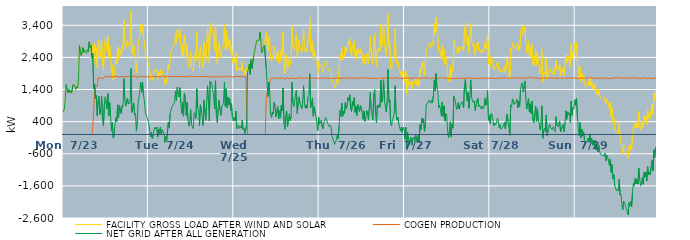
| Category | FACILITY GROSS LOAD AFTER WIND AND SOLAR | COGEN PRODUCTION | NET GRID AFTER ALL GENERATION |
|---|---|---|---|
|  Mon  7/23 | 702 | 0 | 702 |
|  Mon  7/23 | 799 | 0 | 799 |
|  Mon  7/23 | 1079 | 0 | 1079 |
|  Mon  7/23 | 1556 | 0 | 1556 |
|  Mon  7/23 | 1397 | 0 | 1397 |
|  Mon  7/23 | 1298 | 0 | 1298 |
|  Mon  7/23 | 1408 | 0 | 1408 |
|  Mon  7/23 | 1308 | 0 | 1308 |
|  Mon  7/23 | 1374 | 0 | 1374 |
|  Mon  7/23 | 1288 | 0 | 1288 |
|  Mon  7/23 | 1319 | 0 | 1319 |
|  Mon  7/23 | 1556 | 0 | 1556 |
|  Mon  7/23 | 1529 | 0 | 1529 |
|  Mon  7/23 | 1503 | 0 | 1503 |
|  Mon  7/23 | 1401 | 0 | 1401 |
|  Mon  7/23 | 1492 | 0 | 1492 |
|  Mon  7/23 | 1454 | 0 | 1454 |
|  Mon  7/23 | 1780 | 0 | 1780 |
|  Mon  7/23 | 2769 | 0 | 2769 |
|  Mon  7/23 | 2550 | 0 | 2550 |
|  Mon  7/23 | 2458 | 0 | 2458 |
|  Mon  7/23 | 2589 | 0 | 2589 |
|  Mon  7/23 | 2709 | 0 | 2709 |
|  Mon  7/23 | 2554 | 0 | 2554 |
|  Mon  7/23 | 2620 | 0 | 2620 |
|  Mon  7/23 | 2585 | 0 | 2585 |
|  Mon  7/23 | 2529 | 0 | 2529 |
|  Mon  7/23 | 2651 | 0 | 2651 |
|  Mon  7/23 | 2573 | 0 | 2573 |
|  Mon  7/23 | 2883 | 0 | 2883 |
|  Mon  7/23 | 2704 | 0 | 2704 |
|  Mon  7/23 | 2775 | 0 | 2775 |
|  Mon  7/23 | 2386 | 0 | 2386 |
|  Mon  7/23 | 2775 | 251 | 2524 |
|  Mon  7/23 | 2172 | 757 | 1415 |
|  Mon  7/23 | 2838 | 1263 | 1575 |
|  Mon  7/23 | 2608 | 1498 | 1110 |
|  Mon  7/23 | 2706 | 1492 | 1214 |
|  Mon  7/23 | 2077 | 1494 | 583 |
|  Mon  7/23 | 2824 | 1761 | 1063 |
|  Mon  7/23 | 2940 | 1755 | 1185 |
|  Mon  7/23 | 2398 | 1769 | 629 |
|  Mon  7/23 | 2560 | 1768 | 792 |
|  Mon  7/23 | 2927 | 1745 | 1182 |
|  Mon  7/23 | 2202 | 1740 | 462 |
|  Mon  7/23 | 2003 | 1742 | 261 |
|  Mon  7/23 | 2730 | 1789 | 941 |
|  Mon  7/23 | 2979 | 1807 | 1172 |
|  Mon  7/23 | 3000 | 1812 | 1188 |
|  Mon  7/23 | 2598 | 1799 | 799 |
|  Mon  7/23 | 3065 | 1792 | 1273 |
|  Mon  7/23 | 2387 | 1799 | 588 |
|  Mon  7/23 | 2784 | 1790 | 994 |
|  Mon  7/23 | 2394 | 1802 | 592 |
|  Mon  7/23 | 1924 | 1820 | 104 |
|  Mon  7/23 | 2160 | 1782 | 378 |
|  Mon  7/23 | 1696 | 1801 | -105 |
|  Mon  7/23 | 1768 | 1813 | -45 |
|  Mon  7/23 | 2136 | 1798 | 338 |
|  Mon  7/23 | 2332 | 1804 | 528 |
|  Mon  7/23 | 2198 | 1795 | 403 |
|  Mon  7/23 | 2732 | 1808 | 924 |
|  Mon  7/23 | 2335 | 1809 | 526 |
|  Mon  7/23 | 2693 | 1782 | 911 |
|  Mon  7/23 | 2543 | 1809 | 734 |
|  Mon  7/23 | 2457 | 1809 | 648 |
|  Mon  7/23 | 2711 | 1812 | 899 |
|  Mon  7/23 | 2653 | 1793 | 860 |
|  Mon  7/23 | 3557 | 1817 | 1740 |
|  Mon  7/23 | 2889 | 1802 | 1087 |
|  Mon  7/23 | 2673 | 1790 | 883 |
|  Mon  7/23 | 2658 | 1796 | 862 |
|  Mon  7/23 | 2923 | 1801 | 1122 |
|  Mon  7/23 | 2754 | 1798 | 956 |
|  Mon  7/23 | 2728 | 1799 | 929 |
|  Mon  7/23 | 2783 | 1804 | 979 |
|  Mon  7/23 | 3854 | 1802 | 2052 |
|  Mon  7/23 | 2509 | 1818 | 691 |
|  Mon  7/23 | 2657 | 1808 | 849 |
|  Mon  7/23 | 2794 | 1812 | 982 |
|  Mon  7/23 | 2410 | 1806 | 604 |
|  Mon  7/23 | 2460 | 1805 | 655 |
|  Mon  7/23 | 1906 | 1800 | 106 |
|  Mon  7/23 | 2208 | 1783 | 425 |
|  Mon  7/23 | 2785 | 1786 | 999 |
|  Mon  7/23 | 2978 | 1806 | 1172 |
|  Mon  7/23 | 2995 | 1811 | 1184 |
|  Mon  7/23 | 3436 | 1808 | 1628 |
|  Mon  7/23 | 3121 | 1813 | 1308 |
|  Mon  7/23 | 3409 | 1796 | 1613 |
|  Mon  7/23 | 3038 | 1807 | 1231 |
|  Mon  7/23 | 2859 | 1811 | 1048 |
|  Mon  7/23 | 2522 | 1798 | 724 |
|  Mon  7/23 | 2396 | 1796 | 600 |
|  Mon  7/23 | 2377 | 1807 | 570 |
|  Mon  7/23 | 2259 | 1800 | 459 |
|  Tue  7/24 | 2127 | 1796 | 331 |
|  Tue  7/24 | 2090 | 1790 | 300 |
|  Tue  7/24 | 1727 | 1795 | -68 |
|  Tue  7/24 | 1855 | 1794 | 61 |
|  Tue  7/24 | 1675 | 1801 | -126 |
|  Tue  7/24 | 1834 | 1815 | 19 |
|  Tue  7/24 | 1957 | 1810 | 147 |
|  Tue  7/24 | 2021 | 1796 | 225 |
|  Tue  7/24 | 1980 | 1812 | 168 |
|  Tue  7/24 | 2037 | 1804 | 233 |
|  Tue  7/24 | 1722 | 1804 | -82 |
|  Tue  7/24 | 1938 | 1789 | 149 |
|  Tue  7/24 | 1840 | 1811 | 29 |
|  Tue  7/24 | 2038 | 1808 | 230 |
|  Tue  7/24 | 1798 | 1801 | -3 |
|  Tue  7/24 | 1967 | 1820 | 147 |
|  Tue  7/24 | 1969 | 1810 | 159 |
|  Tue  7/24 | 1821 | 1802 | 19 |
|  Tue  7/24 | 1552 | 1799 | -247 |
|  Tue  7/24 | 1728 | 1793 | -65 |
|  Tue  7/24 | 1611 | 1813 | -202 |
|  Tue  7/24 | 1634 | 1819 | -185 |
|  Tue  7/24 | 2189 | 1805 | 384 |
|  Tue  7/24 | 2023 | 1809 | 214 |
|  Tue  7/24 | 2448 | 1807 | 641 |
|  Tue  7/24 | 2581 | 1804 | 777 |
|  Tue  7/24 | 2675 | 1809 | 866 |
|  Tue  7/24 | 2644 | 1800 | 844 |
|  Tue  7/24 | 2730 | 1781 | 949 |
|  Tue  7/24 | 2806 | 1812 | 994 |
|  Tue  7/24 | 3149 | 1801 | 1348 |
|  Tue  7/24 | 2857 | 1796 | 1061 |
|  Tue  7/24 | 3267 | 1800 | 1467 |
|  Tue  7/24 | 3079 | 1804 | 1275 |
|  Tue  7/24 | 2988 | 1819 | 1169 |
|  Tue  7/24 | 3261 | 1805 | 1456 |
|  Tue  7/24 | 2800 | 1810 | 990 |
|  Tue  7/24 | 2447 | 1799 | 648 |
|  Tue  7/24 | 2795 | 1807 | 988 |
|  Tue  7/24 | 2375 | 1810 | 565 |
|  Tue  7/24 | 3091 | 1810 | 1281 |
|  Tue  7/24 | 2966 | 1799 | 1167 |
|  Tue  7/24 | 2400 | 1809 | 591 |
|  Tue  7/24 | 2794 | 1794 | 1000 |
|  Tue  7/24 | 2283 | 1808 | 475 |
|  Tue  7/24 | 2073 | 1814 | 259 |
|  Tue  7/24 | 2182 | 1793 | 389 |
|  Tue  7/24 | 2598 | 1815 | 783 |
|  Tue  7/24 | 2125 | 1811 | 314 |
|  Tue  7/24 | 2031 | 1806 | 225 |
|  Tue  7/24 | 1972 | 1792 | 180 |
|  Tue  7/24 | 2484 | 1807 | 677 |
|  Tue  7/24 | 2433 | 1800 | 633 |
|  Tue  7/24 | 2293 | 1791 | 502 |
|  Tue  7/24 | 3197 | 1777 | 1420 |
|  Tue  7/24 | 2618 | 1801 | 817 |
|  Tue  7/24 | 2553 | 1781 | 772 |
|  Tue  7/24 | 2069 | 1798 | 271 |
|  Tue  7/24 | 2733 | 1809 | 924 |
|  Tue  7/24 | 2593 | 1814 | 779 |
|  Tue  7/24 | 2553 | 1804 | 749 |
|  Tue  7/24 | 2078 | 1796 | 282 |
|  Tue  7/24 | 2871 | 1811 | 1060 |
|  Tue  7/24 | 2842 | 1801 | 1041 |
|  Tue  7/24 | 2235 | 1795 | 440 |
|  Tue  7/24 | 2772 | 1804 | 968 |
|  Tue  7/24 | 3317 | 1800 | 1517 |
|  Tue  7/24 | 2844 | 1799 | 1045 |
|  Tue  7/24 | 2226 | 1807 | 419 |
|  Tue  7/24 | 3461 | 1802 | 1659 |
|  Tue  7/24 | 3425 | 1818 | 1607 |
|  Tue  7/24 | 3332 | 1779 | 1553 |
|  Tue  7/24 | 3361 | 1787 | 1574 |
|  Tue  7/24 | 2981 | 1808 | 1173 |
|  Tue  7/24 | 2609 | 1813 | 796 |
|  Tue  7/24 | 3459 | 1786 | 1673 |
|  Tue  7/24 | 2388 | 1798 | 590 |
|  Tue  7/24 | 2172 | 1802 | 370 |
|  Tue  7/24 | 2646 | 1814 | 832 |
|  Tue  7/24 | 2858 | 1794 | 1064 |
|  Tue  7/24 | 2579 | 1807 | 772 |
|  Tue  7/24 | 2382 | 1785 | 597 |
|  Tue  7/24 | 2664 | 1796 | 868 |
|  Tue  7/24 | 2658 | 1815 | 843 |
|  Tue  7/24 | 2785 | 1814 | 971 |
|  Tue  7/24 | 3424 | 1792 | 1632 |
|  Tue  7/24 | 2675 | 1797 | 878 |
|  Tue  7/24 | 3238 | 1818 | 1420 |
|  Tue  7/24 | 2650 | 1812 | 838 |
|  Tue  7/24 | 2976 | 1808 | 1168 |
|  Tue  7/24 | 2729 | 1808 | 921 |
|  Tue  7/24 | 2930 | 1810 | 1120 |
|  Tue  7/24 | 2562 | 1820 | 742 |
|  Tue  7/24 | 2742 | 1781 | 961 |
|  Tue  7/24 | 2317 | 1790 | 527 |
|  Tue  7/24 | 2212 | 1792 | 420 |
|  Wed  7/25 | 2347 | 1813 | 534 |
|  Wed  7/25 | 2223 | 1803 | 420 |
|  Wed  7/25 | 2523 | 1799 | 724 |
|  Wed  7/25 | 1988 | 1811 | 177 |
|  Wed  7/25 | 1998 | 1785 | 213 |
|  Wed  7/25 | 2096 | 1800 | 296 |
|  Wed  7/25 | 1990 | 1797 | 193 |
|  Wed  7/25 | 2059 | 1804 | 255 |
|  Wed  7/25 | 1997 | 1802 | 195 |
|  Wed  7/25 | 2247 | 1802 | 445 |
|  Wed  7/25 | 1949 | 1808 | 141 |
|  Wed  7/25 | 2007 | 1813 | 194 |
|  Wed  7/25 | 1821 | 1792 | 29 |
|  Wed  7/25 | 1847 | 1807 | 40 |
|  Wed  7/25 | 2074 | 1798 | 276 |
|  Wed  7/25 | 1924 | 0 | 1924 |
|  Wed  7/25 | 1922 | 0 | 1922 |
|  Wed  7/25 | 2195 | 0 | 2195 |
|  Wed  7/25 | 1867 | 0 | 1867 |
|  Wed  7/25 | 2332 | 0 | 2332 |
|  Wed  7/25 | 2051 | 0 | 2051 |
|  Wed  7/25 | 2074 | 0 | 2074 |
|  Wed  7/25 | 2467 | 0 | 2467 |
|  Wed  7/25 | 2591 | 0 | 2591 |
|  Wed  7/25 | 2746 | 0 | 2746 |
|  Wed  7/25 | 2872 | 0 | 2872 |
|  Wed  7/25 | 2940 | 0 | 2940 |
|  Wed  7/25 | 2962 | 0 | 2962 |
|  Wed  7/25 | 2929 | 0 | 2929 |
|  Wed  7/25 | 3186 | 0 | 3186 |
|  Wed  7/25 | 2918 | 0 | 2918 |
|  Wed  7/25 | 2550 | 0 | 2550 |
|  Wed  7/25 | 2613 | 0 | 2613 |
|  Wed  7/25 | 2726 | 0 | 2726 |
|  Wed  7/25 | 2785 | 0 | 2785 |
|  Wed  7/25 | 2791 | 0 | 2791 |
|  Wed  7/25 | 3201 | 1117 | 2084 |
|  Wed  7/25 | 3211 | 1109 | 2102 |
|  Wed  7/25 | 2596 | 1410 | 1186 |
|  Wed  7/25 | 3042 | 1413 | 1629 |
|  Wed  7/25 | 2916 | 1608 | 1308 |
|  Wed  7/25 | 2357 | 1735 | 622 |
|  Wed  7/25 | 2281 | 1745 | 536 |
|  Wed  7/25 | 2459 | 1760 | 699 |
|  Wed  7/25 | 2396 | 1758 | 638 |
|  Wed  7/25 | 2750 | 1744 | 1006 |
|  Wed  7/25 | 2671 | 1773 | 898 |
|  Wed  7/25 | 2313 | 1761 | 552 |
|  Wed  7/25 | 2317 | 1750 | 567 |
|  Wed  7/25 | 2612 | 1747 | 865 |
|  Wed  7/25 | 2230 | 1744 | 486 |
|  Wed  7/25 | 2492 | 1755 | 737 |
|  Wed  7/25 | 2266 | 1747 | 519 |
|  Wed  7/25 | 2658 | 1756 | 902 |
|  Wed  7/25 | 2474 | 1739 | 735 |
|  Wed  7/25 | 3196 | 1755 | 1441 |
|  Wed  7/25 | 2108 | 1739 | 369 |
|  Wed  7/25 | 1888 | 1727 | 161 |
|  Wed  7/25 | 2303 | 1734 | 569 |
|  Wed  7/25 | 2478 | 1743 | 735 |
|  Wed  7/25 | 2019 | 1776 | 243 |
|  Wed  7/25 | 2189 | 1733 | 456 |
|  Wed  7/25 | 2396 | 1753 | 643 |
|  Wed  7/25 | 2175 | 1746 | 429 |
|  Wed  7/25 | 2296 | 1755 | 541 |
|  Wed  7/25 | 3390 | 1760 | 1630 |
|  Wed  7/25 | 2740 | 1750 | 990 |
|  Wed  7/25 | 2626 | 1754 | 872 |
|  Wed  7/25 | 2739 | 1734 | 1005 |
|  Wed  7/25 | 3006 | 1745 | 1261 |
|  Wed  7/25 | 3128 | 1747 | 1381 |
|  Wed  7/25 | 2403 | 1748 | 655 |
|  Wed  7/25 | 2770 | 1757 | 1013 |
|  Wed  7/25 | 2933 | 1764 | 1169 |
|  Wed  7/25 | 2730 | 1758 | 972 |
|  Wed  7/25 | 2727 | 1766 | 961 |
|  Wed  7/25 | 2543 | 1740 | 803 |
|  Wed  7/25 | 2736 | 1754 | 982 |
|  Wed  7/25 | 3264 | 1743 | 1521 |
|  Wed  7/25 | 2743 | 1746 | 997 |
|  Wed  7/25 | 2571 | 1756 | 815 |
|  Wed  7/25 | 2686 | 1764 | 922 |
|  Wed  7/25 | 2569 | 1751 | 818 |
|  Wed  7/25 | 2914 | 1760 | 1154 |
|  Wed  7/25 | 2962 | 1742 | 1220 |
|  Wed  7/25 | 3642 | 1744 | 1898 |
|  Wed  7/25 | 2574 | 1751 | 823 |
|  Wed  7/25 | 2756 | 1757 | 999 |
|  Wed  7/25 | 2901 | 1764 | 1137 |
|  Wed  7/25 | 2329 | 1760 | 569 |
|  Wed  7/25 | 2625 | 1763 | 862 |
|  Wed  7/25 | 2395 | 1747 | 648 |
|  Wed  7/25 | 2329 | 1761 | 568 |
|  Wed  7/25 | 2290 | 1752 | 538 |
|  Wed  7/25 | 1881 | 1766 | 115 |
|  Wed  7/25 | 2282 | 1750 | 532 |
|  Thu  7/26 | 2071 | 1753 | 318 |
|  Thu  7/26 | 2131 | 1762 | 369 |
|  Thu  7/26 | 2178 | 1734 | 444 |
|  Thu  7/26 | 1994 | 1756 | 238 |
|  Thu  7/26 | 1930 | 1755 | 175 |
|  Thu  7/26 | 2141 | 1756 | 385 |
|  Thu  7/26 | 2119 | 1764 | 355 |
|  Thu  7/26 | 2273 | 1746 | 527 |
|  Thu  7/26 | 2206 | 1747 | 459 |
|  Thu  7/26 | 2120 | 1765 | 355 |
|  Thu  7/26 | 2045 | 1745 | 300 |
|  Thu  7/26 | 1981 | 1743 | 238 |
|  Thu  7/26 | 2024 | 1743 | 281 |
|  Thu  7/26 | 1970 | 1741 | 229 |
|  Thu  7/26 | 1694 | 1738 | -44 |
|  Thu  7/26 | 1618 | 1764 | -146 |
|  Thu  7/26 | 1533 | 1742 | -209 |
|  Thu  7/26 | 1444 | 1749 | -305 |
|  Thu  7/26 | 1508 | 1759 | -251 |
|  Thu  7/26 | 1600 | 1758 | -158 |
|  Thu  7/26 | 1744 | 1757 | -13 |
|  Thu  7/26 | 1627 | 1755 | -128 |
|  Thu  7/26 | 2015 | 1751 | 264 |
|  Thu  7/26 | 2497 | 1746 | 751 |
|  Thu  7/26 | 2322 | 1755 | 567 |
|  Thu  7/26 | 2724 | 1748 | 976 |
|  Thu  7/26 | 2331 | 1767 | 564 |
|  Thu  7/26 | 2478 | 1755 | 723 |
|  Thu  7/26 | 2415 | 1766 | 649 |
|  Thu  7/26 | 2757 | 1762 | 995 |
|  Thu  7/26 | 2564 | 1766 | 798 |
|  Thu  7/26 | 2673 | 1761 | 912 |
|  Thu  7/26 | 2894 | 1743 | 1151 |
|  Thu  7/26 | 2794 | 1739 | 1055 |
|  Thu  7/26 | 2990 | 1751 | 1239 |
|  Thu  7/26 | 2567 | 1764 | 803 |
|  Thu  7/26 | 2459 | 1742 | 717 |
|  Thu  7/26 | 2771 | 1753 | 1018 |
|  Thu  7/26 | 2653 | 1759 | 894 |
|  Thu  7/26 | 2912 | 1768 | 1144 |
|  Thu  7/26 | 2437 | 1752 | 685 |
|  Thu  7/26 | 2613 | 1730 | 883 |
|  Thu  7/26 | 2347 | 1757 | 590 |
|  Thu  7/26 | 2690 | 1761 | 929 |
|  Thu  7/26 | 2554 | 1759 | 795 |
|  Thu  7/26 | 2465 | 1751 | 714 |
|  Thu  7/26 | 2651 | 1756 | 895 |
|  Thu  7/26 | 2648 | 1755 | 893 |
|  Thu  7/26 | 2458 | 1754 | 704 |
|  Thu  7/26 | 2232 | 1763 | 469 |
|  Thu  7/26 | 2478 | 1748 | 730 |
|  Thu  7/26 | 2170 | 1762 | 408 |
|  Thu  7/26 | 2279 | 1768 | 511 |
|  Thu  7/26 | 2516 | 1771 | 745 |
|  Thu  7/26 | 2398 | 1749 | 649 |
|  Thu  7/26 | 2199 | 1751 | 448 |
|  Thu  7/26 | 2552 | 1751 | 801 |
|  Thu  7/26 | 3052 | 1745 | 1307 |
|  Thu  7/26 | 2548 | 1751 | 797 |
|  Thu  7/26 | 2365 | 1746 | 619 |
|  Thu  7/26 | 2206 | 1745 | 461 |
|  Thu  7/26 | 2986 | 1748 | 1238 |
|  Thu  7/26 | 3143 | 1745 | 1398 |
|  Thu  7/26 | 2409 | 1764 | 645 |
|  Thu  7/26 | 2113 | 1751 | 362 |
|  Thu  7/26 | 2645 | 1736 | 909 |
|  Thu  7/26 | 2588 | 1762 | 826 |
|  Thu  7/26 | 2688 | 1753 | 935 |
|  Thu  7/26 | 2599 | 1751 | 848 |
|  Thu  7/26 | 3448 | 1758 | 1690 |
|  Thu  7/26 | 2758 | 1757 | 1001 |
|  Thu  7/26 | 2931 | 1757 | 1174 |
|  Thu  7/26 | 3457 | 1753 | 1704 |
|  Thu  7/26 | 2806 | 1757 | 1049 |
|  Thu  7/26 | 2614 | 1763 | 851 |
|  Thu  7/26 | 2462 | 1756 | 706 |
|  Thu  7/26 | 2751 | 1748 | 1003 |
|  Thu  7/26 | 3769 | 1752 | 2017 |
|  Thu  7/26 | 2755 | 1746 | 1009 |
|  Thu  7/26 | 2834 | 1757 | 1077 |
|  Thu  7/26 | 2074 | 1745 | 329 |
|  Thu  7/26 | 2014 | 1752 | 262 |
|  Thu  7/26 | 2236 | 1768 | 468 |
|  Thu  7/26 | 2275 | 1746 | 529 |
|  Thu  7/26 | 2424 | 1759 | 665 |
|  Thu  7/26 | 3282 | 1765 | 1517 |
|  Thu  7/26 | 2431 | 1758 | 673 |
|  Thu  7/26 | 2211 | 1761 | 450 |
|  Thu  7/26 | 2282 | 1738 | 544 |
|  Thu  7/26 | 2095 | 1741 | 354 |
|  Thu  7/26 | 2071 | 1736 | 335 |
|  Thu  7/26 | 1865 | 1751 | 114 |
|  Thu  7/26 | 1984 | 1764 | 220 |
|  Thu  7/26 | 1804 | 1740 | 64 |
|  Thu  7/26 | 1981 | 1754 | 227 |
|  Thu  7/26 | 1942 | 1750 | 192 |
|  Fri  7/27 | 1633 | 1762 | -129 |
|  Fri  7/27 | 1980 | 1761 | 219 |
|  Fri  7/27 | 1263 | 1745 | -482 |
|  Fri  7/27 | 1831 | 1762 | 69 |
|  Fri  7/27 | 1601 | 1756 | -155 |
|  Fri  7/27 | 1474 | 1754 | -280 |
|  Fri  7/27 | 1591 | 1730 | -139 |
|  Fri  7/27 | 1662 | 1745 | -83 |
|  Fri  7/27 | 1423 | 1754 | -331 |
|  Fri  7/27 | 1638 | 1759 | -121 |
|  Fri  7/27 | 1671 | 1752 | -81 |
|  Fri  7/27 | 1561 | 1768 | -207 |
|  Fri  7/27 | 1742 | 1750 | -8 |
|  Fri  7/27 | 1736 | 1744 | -8 |
|  Fri  7/27 | 1517 | 1762 | -245 |
|  Fri  7/27 | 1744 | 1767 | -23 |
|  Fri  7/27 | 1497 | 1753 | -256 |
|  Fri  7/27 | 2039 | 1732 | 307 |
|  Fri  7/27 | 1908 | 1758 | 150 |
|  Fri  7/27 | 2269 | 1764 | 505 |
|  Fri  7/27 | 2121 | 1754 | 367 |
|  Fri  7/27 | 2258 | 1767 | 491 |
|  Fri  7/27 | 1837 | 1742 | 95 |
|  Fri  7/27 | 2055 | 1757 | 298 |
|  Fri  7/27 | 2664 | 1747 | 917 |
|  Fri  7/27 | 2727 | 1764 | 963 |
|  Fri  7/27 | 2730 | 1742 | 988 |
|  Fri  7/27 | 2821 | 1750 | 1071 |
|  Fri  7/27 | 2854 | 1757 | 1097 |
|  Fri  7/27 | 2713 | 1742 | 971 |
|  Fri  7/27 | 2833 | 1755 | 1078 |
|  Fri  7/27 | 2751 | 1765 | 986 |
|  Fri  7/27 | 2964 | 1757 | 1207 |
|  Fri  7/27 | 3463 | 1762 | 1701 |
|  Fri  7/27 | 3105 | 1757 | 1348 |
|  Fri  7/27 | 3656 | 1760 | 1896 |
|  Fri  7/27 | 3230 | 1769 | 1461 |
|  Fri  7/27 | 3118 | 1742 | 1376 |
|  Fri  7/27 | 2590 | 1750 | 840 |
|  Fri  7/27 | 2668 | 1754 | 914 |
|  Fri  7/27 | 2534 | 1756 | 778 |
|  Fri  7/27 | 2353 | 1770 | 583 |
|  Fri  7/27 | 2767 | 1753 | 1014 |
|  Fri  7/27 | 2310 | 1755 | 555 |
|  Fri  7/27 | 2645 | 1752 | 893 |
|  Fri  7/27 | 2165 | 1752 | 413 |
|  Fri  7/27 | 2417 | 1763 | 654 |
|  Fri  7/27 | 2349 | 1750 | 599 |
|  Fri  7/27 | 1858 | 1762 | 96 |
|  Fri  7/27 | 1647 | 1753 | -106 |
|  Fri  7/27 | 1866 | 1769 | 97 |
|  Fri  7/27 | 2143 | 1741 | 402 |
|  Fri  7/27 | 1679 | 1750 | -71 |
|  Fri  7/27 | 2073 | 1745 | 328 |
|  Fri  7/27 | 1956 | 1757 | 199 |
|  Fri  7/27 | 2922 | 1736 | 1186 |
|  Fri  7/27 | 2853 | 1764 | 1089 |
|  Fri  7/27 | 2753 | 1742 | 1011 |
|  Fri  7/27 | 2541 | 1757 | 784 |
|  Fri  7/27 | 2618 | 1762 | 856 |
|  Fri  7/27 | 2736 | 1746 | 990 |
|  Fri  7/27 | 2532 | 1743 | 789 |
|  Fri  7/27 | 2682 | 1760 | 922 |
|  Fri  7/27 | 2665 | 1743 | 922 |
|  Fri  7/27 | 2748 | 1731 | 1017 |
|  Fri  7/27 | 2718 | 1756 | 962 |
|  Fri  7/27 | 2590 | 1756 | 834 |
|  Fri  7/27 | 3261 | 1738 | 1523 |
|  Fri  7/27 | 3466 | 1752 | 1714 |
|  Fri  7/27 | 3092 | 1764 | 1328 |
|  Fri  7/27 | 2791 | 1755 | 1036 |
|  Fri  7/27 | 3061 | 1752 | 1309 |
|  Fri  7/27 | 2543 | 1727 | 816 |
|  Fri  7/27 | 2978 | 1769 | 1209 |
|  Fri  7/27 | 3458 | 1757 | 1701 |
|  Fri  7/27 | 2906 | 1750 | 1156 |
|  Fri  7/27 | 2803 | 1759 | 1044 |
|  Fri  7/27 | 2747 | 1750 | 997 |
|  Fri  7/27 | 2819 | 1766 | 1053 |
|  Fri  7/27 | 2489 | 1745 | 744 |
|  Fri  7/27 | 2461 | 1736 | 725 |
|  Fri  7/27 | 2798 | 1745 | 1053 |
|  Fri  7/27 | 2878 | 1751 | 1127 |
|  Fri  7/27 | 2609 | 1745 | 864 |
|  Fri  7/27 | 2649 | 1739 | 910 |
|  Fri  7/27 | 2650 | 1757 | 893 |
|  Fri  7/27 | 2525 | 1737 | 788 |
|  Fri  7/27 | 2639 | 1750 | 889 |
|  Fri  7/27 | 2549 | 1755 | 794 |
|  Fri  7/27 | 2588 | 1750 | 838 |
|  Fri  7/27 | 2882 | 1757 | 1125 |
|  Fri  7/27 | 2668 | 1757 | 911 |
|  Fri  7/27 | 2790 | 1763 | 1027 |
|  Fri  7/27 | 3129 | 1751 | 1378 |
|  Fri  7/27 | 2194 | 1750 | 444 |
|  Fri  7/27 | 2351 | 1749 | 602 |
|  Sat  7/28 | 2090 | 1753 | 337 |
|  Sat  7/28 | 2426 | 1767 | 659 |
|  Sat  7/28 | 2366 | 1754 | 612 |
|  Sat  7/28 | 2364 | 1747 | 617 |
|  Sat  7/28 | 2012 | 1744 | 268 |
|  Sat  7/28 | 2097 | 1742 | 355 |
|  Sat  7/28 | 2061 | 1751 | 310 |
|  Sat  7/28 | 2117 | 1748 | 369 |
|  Sat  7/28 | 2266 | 1762 | 504 |
|  Sat  7/28 | 2187 | 1752 | 435 |
|  Sat  7/28 | 1976 | 1760 | 216 |
|  Sat  7/28 | 2047 | 1746 | 301 |
|  Sat  7/28 | 1925 | 1761 | 164 |
|  Sat  7/28 | 1896 | 1748 | 148 |
|  Sat  7/28 | 1978 | 1759 | 219 |
|  Sat  7/28 | 2064 | 1768 | 296 |
|  Sat  7/28 | 2139 | 1759 | 380 |
|  Sat  7/28 | 1938 | 1769 | 169 |
|  Sat  7/28 | 1925 | 1763 | 162 |
|  Sat  7/28 | 2381 | 1749 | 632 |
|  Sat  7/28 | 2156 | 1751 | 405 |
|  Sat  7/28 | 1924 | 1747 | 177 |
|  Sat  7/28 | 1738 | 1762 | -24 |
|  Sat  7/28 | 2679 | 1759 | 920 |
|  Sat  7/28 | 2627 | 1757 | 870 |
|  Sat  7/28 | 2864 | 1756 | 1108 |
|  Sat  7/28 | 2879 | 1754 | 1125 |
|  Sat  7/28 | 2703 | 1762 | 941 |
|  Sat  7/28 | 2667 | 1743 | 924 |
|  Sat  7/28 | 2792 | 1764 | 1028 |
|  Sat  7/28 | 2853 | 1760 | 1093 |
|  Sat  7/28 | 2596 | 1763 | 833 |
|  Sat  7/28 | 2781 | 1740 | 1041 |
|  Sat  7/28 | 2624 | 1753 | 871 |
|  Sat  7/28 | 3117 | 1739 | 1378 |
|  Sat  7/28 | 3327 | 1754 | 1573 |
|  Sat  7/28 | 3366 | 1759 | 1607 |
|  Sat  7/28 | 3084 | 1762 | 1322 |
|  Sat  7/28 | 3257 | 1752 | 1505 |
|  Sat  7/28 | 3408 | 1743 | 1665 |
|  Sat  7/28 | 2848 | 1753 | 1095 |
|  Sat  7/28 | 2547 | 1757 | 790 |
|  Sat  7/28 | 2757 | 1760 | 997 |
|  Sat  7/28 | 2897 | 1778 | 1119 |
|  Sat  7/28 | 2451 | 1752 | 699 |
|  Sat  7/28 | 2716 | 1760 | 956 |
|  Sat  7/28 | 2402 | 1752 | 650 |
|  Sat  7/28 | 2803 | 1768 | 1035 |
|  Sat  7/28 | 2200 | 1760 | 440 |
|  Sat  7/28 | 2132 | 1769 | 363 |
|  Sat  7/28 | 2407 | 1747 | 660 |
|  Sat  7/28 | 2628 | 1742 | 886 |
|  Sat  7/28 | 2158 | 1750 | 408 |
|  Sat  7/28 | 2575 | 1769 | 806 |
|  Sat  7/28 | 2182 | 1757 | 425 |
|  Sat  7/28 | 2102 | 1739 | 363 |
|  Sat  7/28 | 1890 | 1750 | 140 |
|  Sat  7/28 | 2018 | 1743 | 275 |
|  Sat  7/28 | 2655 | 1762 | 893 |
|  Sat  7/28 | 1648 | 1764 | -116 |
|  Sat  7/28 | 1880 | 1754 | 126 |
|  Sat  7/28 | 1941 | 1743 | 198 |
|  Sat  7/28 | 1829 | 1740 | 89 |
|  Sat  7/28 | 2368 | 1759 | 609 |
|  Sat  7/28 | 1705 | 1750 | -45 |
|  Sat  7/28 | 1898 | 1749 | 149 |
|  Sat  7/28 | 1990 | 1751 | 239 |
|  Sat  7/28 | 2074 | 1761 | 313 |
|  Sat  7/28 | 1955 | 1764 | 191 |
|  Sat  7/28 | 1957 | 1760 | 197 |
|  Sat  7/28 | 1898 | 1734 | 164 |
|  Sat  7/28 | 2001 | 1756 | 245 |
|  Sat  7/28 | 1866 | 1745 | 121 |
|  Sat  7/28 | 1836 | 1754 | 82 |
|  Sat  7/28 | 2306 | 1752 | 554 |
|  Sat  7/28 | 2028 | 1748 | 280 |
|  Sat  7/28 | 1991 | 1750 | 241 |
|  Sat  7/28 | 2080 | 1754 | 326 |
|  Sat  7/28 | 2175 | 1759 | 416 |
|  Sat  7/28 | 1832 | 1748 | 84 |
|  Sat  7/28 | 1814 | 1754 | 60 |
|  Sat  7/28 | 2004 | 1750 | 254 |
|  Sat  7/28 | 2077 | 1766 | 311 |
|  Sat  7/28 | 1840 | 1762 | 78 |
|  Sat  7/28 | 2122 | 1760 | 362 |
|  Sat  7/28 | 2463 | 1727 | 736 |
|  Sat  7/28 | 2237 | 1764 | 473 |
|  Sat  7/28 | 2464 | 1758 | 706 |
|  Sat  7/28 | 2388 | 1762 | 626 |
|  Sat  7/28 | 2407 | 1738 | 669 |
|  Sat  7/28 | 2129 | 1756 | 373 |
|  Sat  7/28 | 2801 | 1764 | 1037 |
|  Sat  7/28 | 2350 | 1757 | 593 |
|  Sat  7/28 | 2603 | 1759 | 844 |
|  Sat  7/28 | 2564 | 1757 | 807 |
|  Sat  7/28 | 2842 | 1762 | 1080 |
|  Sun  7/29 | 2669 | 1764 | 905 |
|  Sun  7/29 | 2878 | 1758 | 1120 |
|  Sun  7/29 | 2278 | 1733 | 545 |
|  Sun  7/29 | 1926 | 1751 | 175 |
|  Sun  7/29 | 1716 | 1747 | -31 |
|  Sun  7/29 | 2116 | 1742 | 374 |
|  Sun  7/29 | 1659 | 1764 | -105 |
|  Sun  7/29 | 1910 | 1744 | 166 |
|  Sun  7/29 | 1714 | 1756 | -42 |
|  Sun  7/29 | 1833 | 1750 | 83 |
|  Sun  7/29 | 1561 | 1747 | -186 |
|  Sun  7/29 | 1482 | 1728 | -246 |
|  Sun  7/29 | 1485 | 1754 | -269 |
|  Sun  7/29 | 1531 | 1750 | -219 |
|  Sun  7/29 | 1657 | 1769 | -112 |
|  Sun  7/29 | 1511 | 1759 | -248 |
|  Sun  7/29 | 1787 | 1767 | 20 |
|  Sun  7/29 | 1536 | 1750 | -214 |
|  Sun  7/29 | 1642 | 1763 | -121 |
|  Sun  7/29 | 1416 | 1752 | -336 |
|  Sun  7/29 | 1575 | 1754 | -179 |
|  Sun  7/29 | 1412 | 1757 | -345 |
|  Sun  7/29 | 1554 | 1744 | -190 |
|  Sun  7/29 | 1269 | 1742 | -473 |
|  Sun  7/29 | 1400 | 1766 | -366 |
|  Sun  7/29 | 1220 | 1761 | -541 |
|  Sun  7/29 | 1409 | 1738 | -329 |
|  Sun  7/29 | 1216 | 1754 | -538 |
|  Sun  7/29 | 1139 | 1759 | -620 |
|  Sun  7/29 | 1123 | 1744 | -621 |
|  Sun  7/29 | 1077 | 1729 | -652 |
|  Sun  7/29 | 1103 | 1758 | -655 |
|  Sun  7/29 | 1106 | 1771 | -665 |
|  Sun  7/29 | 1157 | 1747 | -590 |
|  Sun  7/29 | 938 | 1753 | -815 |
|  Sun  7/29 | 1107 | 1755 | -648 |
|  Sun  7/29 | 1048 | 1743 | -695 |
|  Sun  7/29 | 1067 | 1757 | -690 |
|  Sun  7/29 | 778 | 1741 | -963 |
|  Sun  7/29 | 988 | 1751 | -763 |
|  Sun  7/29 | 564 | 1747 | -1183 |
|  Sun  7/29 | 825 | 1762 | -937 |
|  Sun  7/29 | 364 | 1747 | -1383 |
|  Sun  7/29 | 514 | 1768 | -1254 |
|  Sun  7/29 | 173 | 1770 | -1597 |
|  Sun  7/29 | 186 | 1757 | -1571 |
|  Sun  7/29 | 13 | 1762 | -1749 |
|  Sun  7/29 | 43 | 1752 | -1709 |
|  Sun  7/29 | 13 | 1772 | -1759 |
|  Sun  7/29 | 361 | 1750 | -1389 |
|  Sun  7/29 | -125 | 1762 | -1887 |
|  Sun  7/29 | -101 | 1752 | -1853 |
|  Sun  7/29 | -410 | 1757 | -2167 |
|  Sun  7/29 | -604 | 1743 | -2347 |
|  Sun  7/29 | -322 | 1753 | -2075 |
|  Sun  7/29 | -366 | 1753 | -2119 |
|  Sun  7/29 | -386 | 1761 | -2147 |
|  Sun  7/29 | -552 | 1753 | -2305 |
|  Sun  7/29 | -616 | 1764 | -2380 |
|  Sun  7/29 | -743 | 1760 | -2503 |
|  Sun  7/29 | -376 | 1748 | -2124 |
|  Sun  7/29 | -474 | 1750 | -2224 |
|  Sun  7/29 | -322 | 1757 | -2079 |
|  Sun  7/29 | -475 | 1770 | -2245 |
|  Sun  7/29 | -21 | 1756 | -1777 |
|  Sun  7/29 | 236 | 1759 | -1523 |
|  Sun  7/29 | 175 | 1764 | -1589 |
|  Sun  7/29 | 393 | 1764 | -1371 |
|  Sun  7/29 | 213 | 1754 | -1541 |
|  Sun  7/29 | 351 | 1746 | -1395 |
|  Sun  7/29 | 209 | 1751 | -1542 |
|  Sun  7/29 | 709 | 1759 | -1050 |
|  Sun  7/29 | 373 | 1746 | -1373 |
|  Sun  7/29 | 142 | 1744 | -1602 |
|  Sun  7/29 | 204 | 1748 | -1544 |
|  Sun  7/29 | 416 | 1758 | -1342 |
|  Sun  7/29 | 206 | 1756 | -1550 |
|  Sun  7/29 | 568 | 1745 | -1177 |
|  Sun  7/29 | 451 | 1775 | -1324 |
|  Sun  7/29 | 573 | 1739 | -1166 |
|  Sun  7/29 | 313 | 1759 | -1446 |
|  Sun  7/29 | 755 | 1750 | -995 |
|  Sun  7/29 | 509 | 1763 | -1254 |
|  Sun  7/29 | 593 | 1762 | -1169 |
|  Sun  7/29 | 500 | 1762 | -1262 |
|  Sun  7/29 | 749 | 1733 | -984 |
|  Sun  7/29 | 950 | 1754 | -804 |
|  Sun  7/29 | 624 | 1750 | -1126 |
|  Sun  7/29 | 1280 | 1756 | -476 |
|  Sun  7/29 | 1046 | 1755 | -709 |
|  Sun  7/29 | 1370 | 1768 | -398 |
|  Sun  7/29 | 1207 | 1750 | -543 |